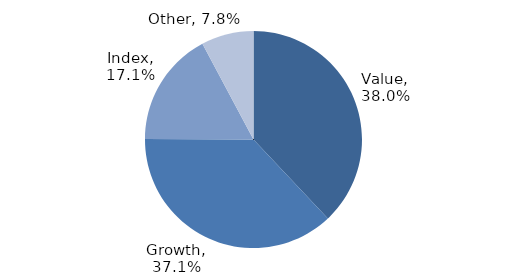
| Category | Investment Style |
|---|---|
| Value | 0.38 |
| Growth | 0.371 |
| Index | 0.171 |
| Other | 0.078 |